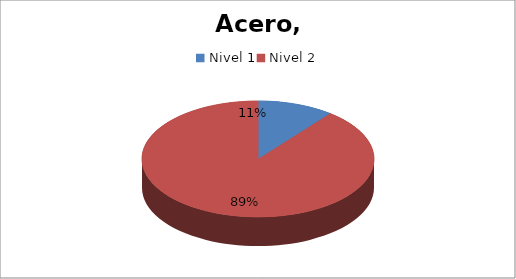
| Category | QxHH |
|---|---|
| Nivel 1 | 730.34 |
| Nivel 2 | 6107.94 |